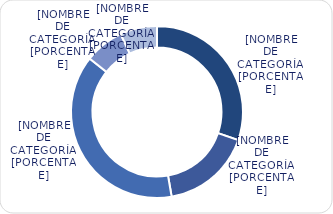
| Category | Series 0 |
|---|---|
| Menores de 3% | 4516.4 |
| Entre 3% y 6% | 2529 |
| Entre 6% y 8% | 5723.2 |
| Entre 8% y 9% | 1101.1 |
| Mayores de 9% | 1034 |